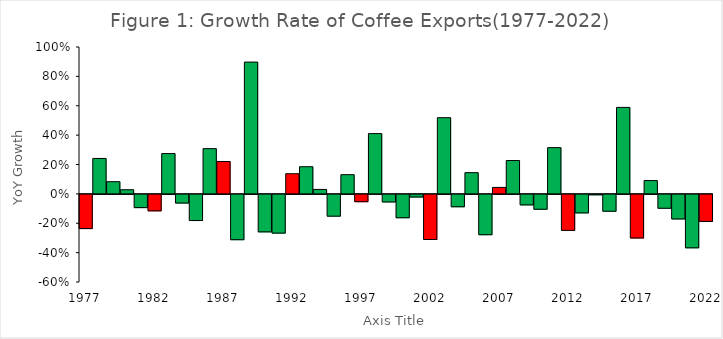
| Category | Series 0 |
|---|---|
| 1977.0 | -0.233 |
| 1978.0 | 0.241 |
| 1979.0 | 0.083 |
| 1980.0 | 0.028 |
| 1981.0 | -0.09 |
| 1982.0 | -0.112 |
| 1983.0 | 0.274 |
| 1984.0 | -0.059 |
| 1985.0 | -0.178 |
| 1986.0 | 0.308 |
| 1987.0 | 0.22 |
| 1988.0 | -0.309 |
| 1989.0 | 0.897 |
| 1990.0 | -0.255 |
| 1991.0 | -0.264 |
| 1992.0 | 0.137 |
| 1993.0 | 0.185 |
| 1994.0 | 0.03 |
| 1995.0 | -0.148 |
| 1996.0 | 0.131 |
| 1997.0 | -0.05 |
| 1998.0 | 0.41 |
| 1999.0 | -0.051 |
| 2000.0 | -0.159 |
| 2001.0 | -0.018 |
| 2002.0 | -0.307 |
| 2003.0 | 0.519 |
| 2004.0 | -0.084 |
| 2005.0 | 0.144 |
| 2006.0 | -0.275 |
| 2007.0 | 0.044 |
| 2008.0 | 0.227 |
| 2009.0 | -0.072 |
| 2010.0 | -0.101 |
| 2011.0 | 0.315 |
| 2012.0 | -0.245 |
| 2013.0 | -0.126 |
| 2014.0 | -0.003 |
| 2015.0 | -0.115 |
| 2016.0 | 0.589 |
| 2017.0 | -0.297 |
| 2018.0 | 0.091 |
| 2019.0 | -0.095 |
| 2020.0 | -0.167 |
| 2021.0 | -0.364 |
| 2022.0 | -0.184 |